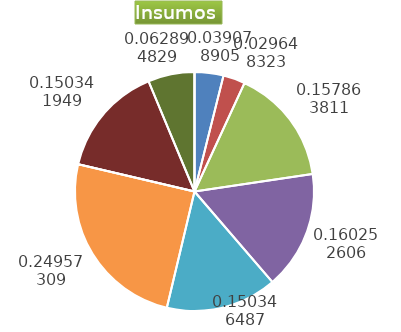
| Category | Series 0 |
|---|---|
| Control arvenses | 687680 |
| Control fitosanitario | 521728 |
| Cosecha y beneficio | 2777963.855 |
| Fertilización | 2820000 |
| Instalación | 2645679.862 |
| Otros | 4391792 |
| Podas | 0 |
| Riego | 2645600 |
| Transporte | 1106774 |
| Tutorado | 0 |